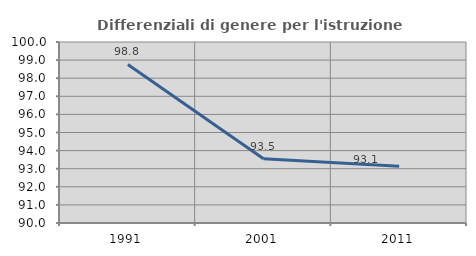
| Category | Differenziali di genere per l'istruzione superiore |
|---|---|
| 1991.0 | 98.76 |
| 2001.0 | 93.548 |
| 2011.0 | 93.139 |